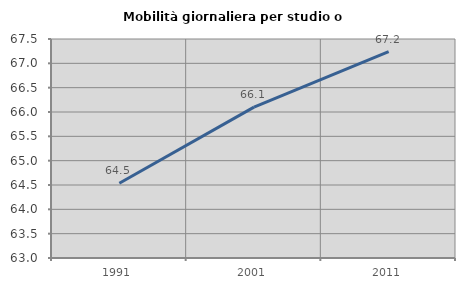
| Category | Mobilità giornaliera per studio o lavoro |
|---|---|
| 1991.0 | 64.536 |
| 2001.0 | 66.101 |
| 2011.0 | 67.242 |